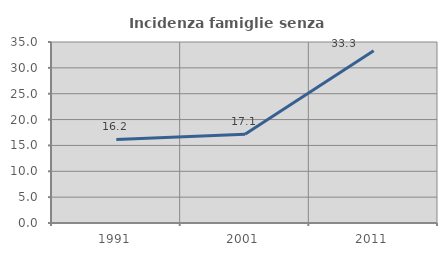
| Category | Incidenza famiglie senza nuclei |
|---|---|
| 1991.0 | 16.155 |
| 2001.0 | 17.146 |
| 2011.0 | 33.306 |